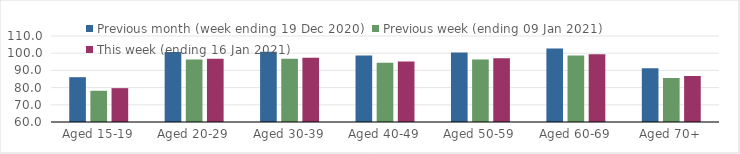
| Category | Previous month (week ending 19 Dec 2020) | Previous week (ending 09 Jan 2021) | This week (ending 16 Jan 2021) |
|---|---|---|---|
| Aged 15-19 | 86.06 | 78.15 | 79.68 |
| Aged 20-29 | 100.74 | 96.29 | 96.84 |
| Aged 30-39 | 100.83 | 96.83 | 97.32 |
| Aged 40-49 | 98.7 | 94.47 | 95.22 |
| Aged 50-59 | 100.38 | 96.33 | 97.04 |
| Aged 60-69 | 102.76 | 98.71 | 99.36 |
| Aged 70+ | 91.25 | 85.59 | 86.75 |